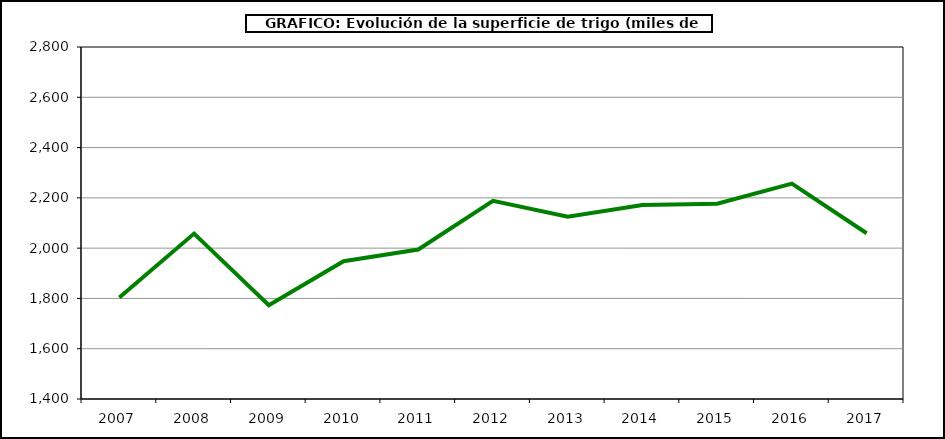
| Category | Superficie |
|---|---|
| 2007.0 | 1803.313 |
| 2008.0 | 2057.87 |
| 2009.0 | 1772.752 |
| 2010.0 | 1948.073 |
| 2011.0 | 1994.653 |
| 2012.0 | 2188.171 |
| 2013.0 | 2124.969 |
| 2014.0 | 2171.672 |
| 2015.0 | 2176.353 |
| 2016.0 | 2256.848 |
| 2017.0 | 2059.224 |